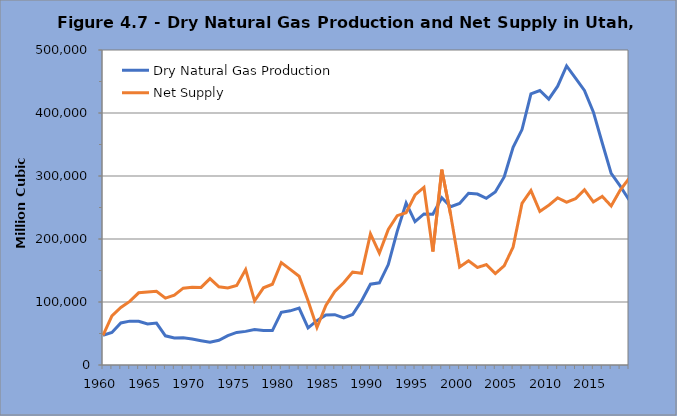
| Category | Dry Natural Gas Production | Net Supply |
|---|---|---|
| 1960.0 | 47138 | 47107 |
| 1961.0 | 51523 | 77960 |
| 1962.0 | 66761 | 91265 |
| 1963.0 | 69623 | 100974 |
| 1964.0 | 69512 | 114579 |
| 1965.0 | 65270 | 115751 |
| 1966.0 | 66597 | 117114 |
| 1967.0 | 46332 | 106165 |
| 1968.0 | 42885 | 110816 |
| 1969.0 | 43321 | 121972 |
| 1970.0 | 41288 | 123588 |
| 1971.0 | 38596 | 123157 |
| 1972.0 | 36092 | 137194 |
| 1973.0 | 39226 | 124208 |
| 1974.0 | 46564 | 122306 |
| 1975.0 | 51695 | 126333 |
| 1976.0 | 53384 | 151401 |
| 1977.0 | 56172 | 101897 |
| 1978.0 | 54846 | 122571 |
| 1979.0 | 54655 | 128190 |
| 1980.0 | 83691 | 162656 |
| 1981.0 | 85972 | 151790 |
| 1982.0 | 90325 | 140835 |
| 1983.0 | 58978 | 102046 |
| 1984.0 | 70439 | 59511 |
| 1985.0 | 79531 | 94570 |
| 1986.0 | 79874 | 116609 |
| 1987.0 | 74762 | 130433 |
| 1988.0 | 80135 | 147436 |
| 1989.0 | 101787 | 145566.58 |
| 1990.0 | 128296 | 208021.611 |
| 1991.0 | 130425 | 177471.977 |
| 1992.0 | 159442 | 215302.682 |
| 1993.0 | 212100.966 | 237055.995 |
| 1994.0 | 257077.886 | 241722.181 |
| 1995.0 | 227610.955 | 269908.1 |
| 1996.0 | 239796.893 | 281895.452 |
| 1997.0 | 239267.45 | 180105.076 |
| 1998.0 | 265539.471 | 310003.634 |
| 1999.0 | 251206.559 | 238230.006 |
| 2000.0 | 256489.715 | 155549.126 |
| 2001.0 | 272534.466 | 165435.798 |
| 2002.0 | 271387.343 | 154825.195 |
| 2003.0 | 264654 | 159347 |
| 2004.0 | 274588 | 145064 |
| 2005.0 | 298408 | 157481 |
| 2006.0 | 345409 | 187149 |
| 2007.0 | 373680 | 256632 |
| 2008.0 | 430286 | 276948 |
| 2009.0 | 435673 | 243797 |
| 2010.0 | 422067 | 253533 |
| 2011.0 | 442615 | 265295 |
| 2012.0 | 474756 | 258339 |
| 2013.0 | 455454 | 264026 |
| 2014.0 | 435893 | 278208 |
| 2015.0 | 401722 | 258865 |
| 2016.0 | 352437 | 267634 |
| 2017.0 | 304266 | 252427 |
| 2018.0 | 284264 | 277319 |
| 2019.0 | 262219 | 296036 |